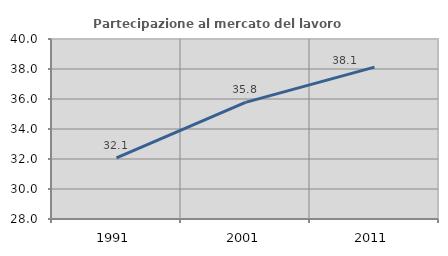
| Category | Partecipazione al mercato del lavoro  femminile |
|---|---|
| 1991.0 | 32.07 |
| 2001.0 | 35.774 |
| 2011.0 | 38.127 |